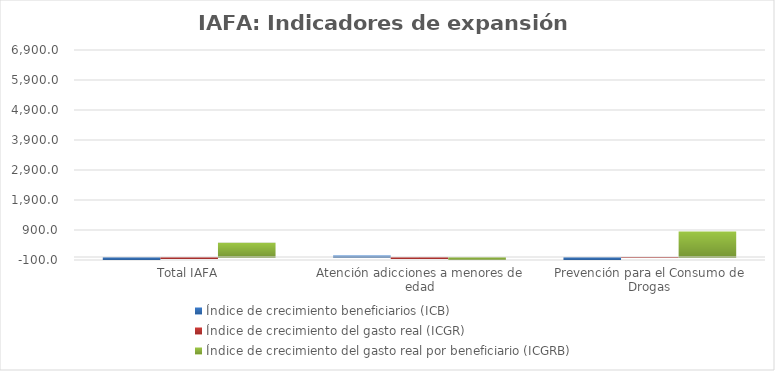
| Category | Índice de crecimiento beneficiarios (ICB)  | Índice de crecimiento del gasto real (ICGR)  | Índice de crecimiento del gasto real por beneficiario (ICGRB)  |
|---|---|---|---|
| Total IAFA | -87.751 | -29.724 | 473.73 |
| Atención adicciones a menores de edad | 50 | -35.162 | -56.775 |
| Prevención para el Consumo de Drogas | -89.66 | -1.368 | 853.903 |